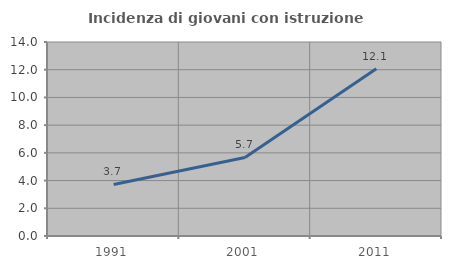
| Category | Incidenza di giovani con istruzione universitaria |
|---|---|
| 1991.0 | 3.721 |
| 2001.0 | 5.672 |
| 2011.0 | 12.075 |